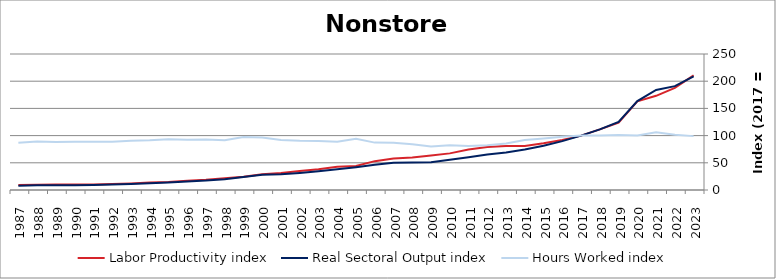
| Category | Labor Productivity index | Real Sectoral Output index | Hours Worked index |
|---|---|---|---|
| 2023.0 | 210.742 | 208.708 | 99.035 |
| 2022.0 | 187.606 | 190.932 | 101.773 |
| 2021.0 | 173.118 | 183.861 | 106.206 |
| 2020.0 | 162.975 | 163.379 | 100.248 |
| 2019.0 | 123.832 | 124.972 | 100.921 |
| 2018.0 | 111.425 | 111.463 | 100.034 |
| 2017.0 | 100 | 100 | 100 |
| 2016.0 | 91.932 | 89.849 | 97.734 |
| 2015.0 | 85.907 | 81.425 | 94.782 |
| 2014.0 | 81.07 | 74.339 | 91.697 |
| 2013.0 | 80.973 | 69.101 | 85.338 |
| 2012.0 | 79.223 | 65.165 | 82.256 |
| 2011.0 | 74.261 | 60.093 | 80.921 |
| 2010.0 | 67.312 | 55.507 | 82.461 |
| 2009.0 | 63.57 | 50.967 | 80.175 |
| 2008.0 | 59.93 | 50.34 | 83.998 |
| 2007.0 | 57.753 | 50.09 | 86.731 |
| 2006.0 | 53.033 | 46.202 | 87.12 |
| 2005.0 | 44.306 | 41.796 | 94.335 |
| 2004.0 | 42.936 | 38.063 | 88.651 |
| 2003.0 | 38.228 | 34.513 | 90.281 |
| 2002.0 | 34.789 | 31.422 | 90.322 |
| 2001.0 | 31.294 | 28.823 | 92.103 |
| 2000.0 | 29.014 | 27.955 | 96.35 |
| 1999.0 | 24.323 | 23.717 | 97.51 |
| 1998.0 | 21.624 | 19.78 | 91.474 |
| 1997.0 | 18.713 | 17.361 | 92.774 |
| 1996.0 | 17.067 | 15.765 | 92.371 |
| 1995.0 | 14.806 | 13.84 | 93.471 |
| 1994.0 | 13.7 | 12.538 | 91.512 |
| 1993.0 | 12.134 | 10.966 | 90.373 |
| 1992.0 | 11.201 | 9.934 | 88.692 |
| 1991.0 | 10.236 | 9.102 | 88.915 |
| 1990.0 | 9.973 | 8.841 | 88.65 |
| 1989.0 | 10.049 | 8.875 | 88.326 |
| 1988.0 | 9.658 | 8.617 | 89.219 |
| 1987.0 | 9.237 | 8.03 | 86.931 |